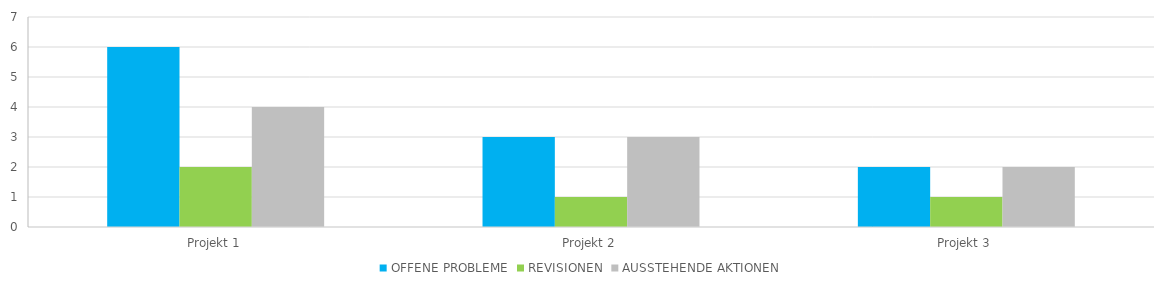
| Category | OFFENE PROBLEME | REVISIONEN | AUSSTEHENDE AKTIONEN |
|---|---|---|---|
| Projekt 1 | 6 | 2 | 4 |
| Projekt 2 | 3 | 1 | 3 |
| Projekt 3 | 2 | 1 | 2 |